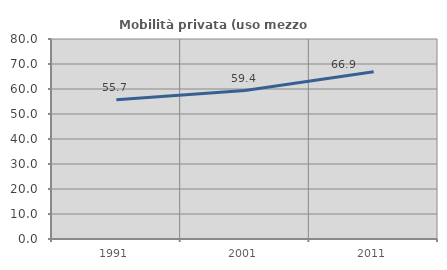
| Category | Mobilità privata (uso mezzo privato) |
|---|---|
| 1991.0 | 55.705 |
| 2001.0 | 59.375 |
| 2011.0 | 66.929 |